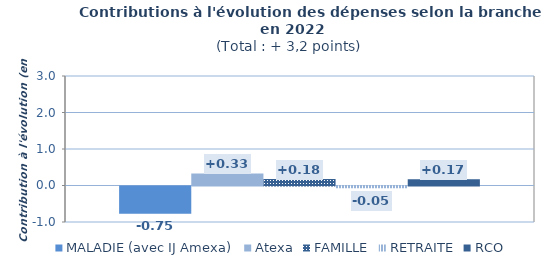
| Category | MALADIE (avec IJ Amexa) | Atexa | FAMILLE | RETRAITE | RCO |
|---|---|---|---|---|---|
| Contri croiss | -0.747 | 0.332 | 0.18 | -0.046 | 0.173 |